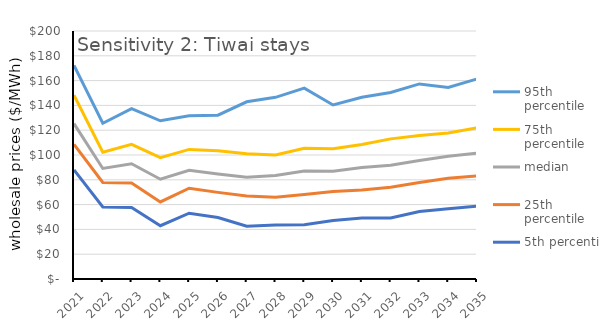
| Category | 95th percentile | 75th percentile | median | 25th percentile | 5th percentile |
|---|---|---|---|---|---|
| 2021.0 | 172.321 | 148.225 | 125.265 | 108.61 | 88.026 |
| 2022.0 | 125.588 | 102.273 | 89.155 | 77.803 | 58.143 |
| 2023.0 | 137.323 | 108.55 | 92.99 | 77.385 | 57.739 |
| 2024.0 | 127.598 | 97.928 | 80.445 | 62.168 | 42.984 |
| 2025.0 | 131.664 | 104.515 | 87.64 | 73.178 | 53.07 |
| 2026.0 | 132.082 | 103.34 | 84.625 | 69.858 | 49.54 |
| 2027.0 | 142.915 | 100.968 | 82.06 | 66.93 | 42.622 |
| 2028.0 | 146.499 | 100.01 | 83.4 | 65.985 | 43.567 |
| 2029.0 | 153.895 | 105.45 | 87.1 | 68.238 | 43.793 |
| 2030.0 | 140.355 | 105.048 | 86.885 | 70.638 | 47.14 |
| 2031.0 | 146.611 | 108.518 | 89.88 | 71.742 | 49.104 |
| 2032.0 | 150.36 | 113.018 | 91.685 | 73.995 | 49.174 |
| 2033.0 | 157.336 | 115.752 | 95.495 | 77.882 | 54.484 |
| 2034.0 | 154.52 | 117.792 | 98.995 | 81.273 | 56.611 |
| 2035.0 | 161.318 | 121.922 | 101.505 | 83.138 | 58.682 |